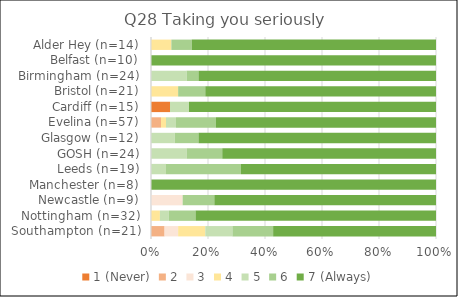
| Category | 1 (Never) | 2 | 3 | 4 | 5 | 6 | 7 (Always) |
|---|---|---|---|---|---|---|---|
| Southampton (n=21) | 0 | 1 | 1 | 2 | 2 | 3 | 12 |
| Nottingham (n=32) | 0 | 0 | 0 | 1 | 1 | 3 | 27 |
| Newcastle (n=9) | 0 | 0 | 1 | 0 | 0 | 1 | 7 |
| Manchester (n=8) | 0 | 0 | 0 | 0 | 0 | 0 | 8 |
| Leeds (n=19) | 0 | 0 | 0 | 0 | 1 | 5 | 13 |
| GOSH (n=24) | 0 | 0 | 0 | 0 | 3 | 3 | 18 |
| Glasgow (n=12) | 0 | 0 | 0 | 0 | 1 | 1 | 10 |
| Evelina (n=57) | 0 | 2 | 0 | 1 | 2 | 8 | 44 |
| Cardiff (n=15) | 1 | 0 | 0 | 0 | 1 | 0 | 13 |
| Bristol (n=21) | 0 | 0 | 0 | 2 | 0 | 2 | 17 |
| Birmingham (n=24) | 0 | 0 | 0 | 0 | 3 | 1 | 20 |
| Belfast (n=10) | 0 | 0 | 0 | 0 | 0 | 0 | 10 |
| Alder Hey (n=14) | 0 | 0 | 0 | 1 | 0 | 1 | 12 |